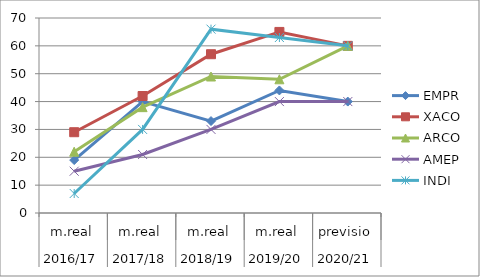
| Category | EMPR | XACO | ARCO | AMEP | INDI |
|---|---|---|---|---|---|
| 0 | 19 | 29 | 22 | 15 | 7 |
| 1 | 40 | 42 | 38 | 21 | 30 |
| 2 | 33 | 57 | 49 | 30 | 66 |
| 3 | 44 | 65 | 48 | 40 | 63 |
| 4 | 40 | 60 | 60 | 40 | 60 |